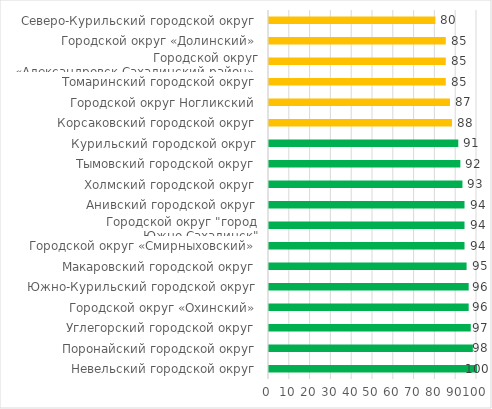
| Category | Series 0 |
|---|---|
| Невельский городской округ | 100 |
| Поронайский городской округ | 98 |
| Углегорский городской округ | 97 |
| Городской округ «Охинский» | 96 |
| Южно-Курильский городской округ | 96 |
| Макаровский городской округ | 95 |
| Городской округ «Смирныховский» | 94 |
| Городской округ "город Южно-Сахалинск" | 94 |
| Анивский городской округ | 94 |
| Холмский городской округ | 93 |
| Тымовский городской округ | 92 |
| Курильский городской округ | 91 |
| Корсаковский городской округ | 88 |
| Городской округ Ногликский | 87 |
| Томаринский городской округ | 85 |
| Городской округ «Александровск-Сахалинский район»  | 85 |
| Городской округ «Долинский» | 85 |
| Северо-Курильский городской округ | 80 |